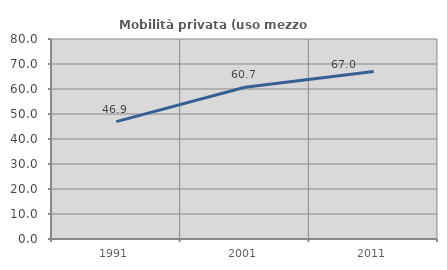
| Category | Mobilità privata (uso mezzo privato) |
|---|---|
| 1991.0 | 46.939 |
| 2001.0 | 60.675 |
| 2011.0 | 67.027 |